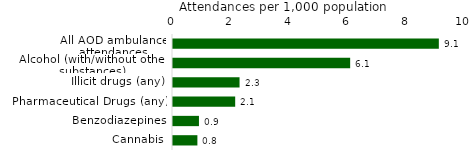
| Category | Series 0 |
|---|---|
| All AOD ambulance attendances | 9.104 |
| Alcohol (with/without other substances) | 6.067 |
| Illicit drugs (any) | 2.279 |
| Pharmaceutical Drugs (any) | 2.13 |
| Benzodiazepines | 0.889 |
| Cannabis | 0.835 |